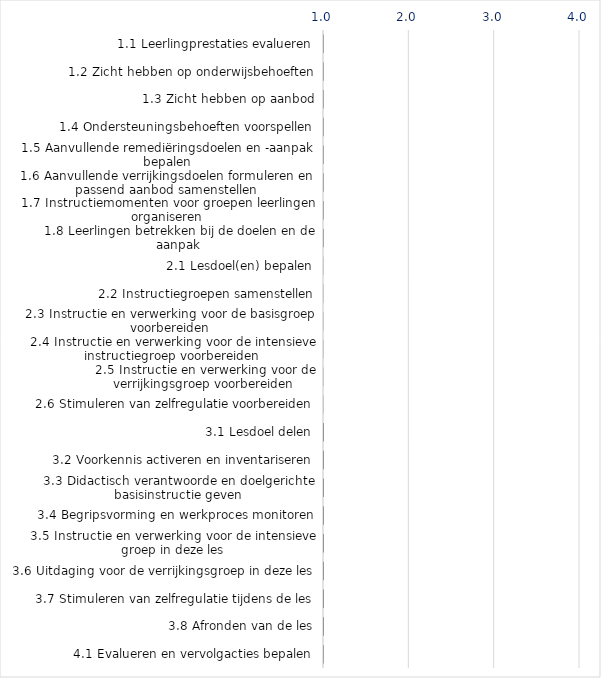
| Category | Series 0 |
|---|---|
| 1.1 Leerlingprestaties evalueren | 0 |
| 1.2 Zicht hebben op onderwijsbehoeften | 0 |
| 1.3 Zicht hebben op aanbod | 0 |
| 1.4 Ondersteuningsbehoeften voorspellen | 0 |
| 1.5 Aanvullende remediëringsdoelen en -aanpak bepalen | 0 |
| 1.6 Aanvullende verrijkingsdoelen formuleren en passend aanbod samenstellen | 0 |
| 1.7 Instructiemomenten voor groepen leerlingen organiseren | 0 |
| 1.8 Leerlingen betrekken bij de doelen en de aanpak | 0 |
| 2.1 Lesdoel(en) bepalen | 0 |
| 2.2 Instructiegroepen samenstellen | 0 |
| 2.3 Instructie en verwerking voor de basisgroep voorbereiden | 0 |
| 2.4 Instructie en verwerking voor de intensieve instructiegroep voorbereiden | 0 |
| 2.5 Instructie en verwerking voor de verrijkingsgroep voorbereiden | 0 |
| 2.6 Stimuleren van zelfregulatie voorbereiden | 0 |
| 3.1 Lesdoel delen | 0 |
| 3.2 Voorkennis activeren en inventariseren | 0 |
| 3.3 Didactisch verantwoorde en doelgerichte basisinstructie geven | 0 |
| 3.4 Begripsvorming en werkproces monitoren | 0 |
| 3.5 Instructie en verwerking voor de intensieve groep in deze les | 0 |
| 3.6 Uitdaging voor de verrijkingsgroep in deze les | 0 |
| 3.7 Stimuleren van zelfregulatie tijdens de les | 0 |
| 3.8 Afronden van de les | 0 |
| 4.1 Evalueren en vervolgacties bepalen | 0 |